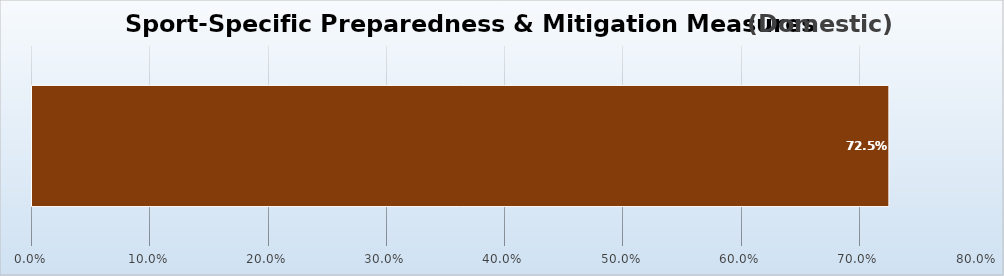
| Category | Series 0 |
|---|---|
| 0 | 0.725 |